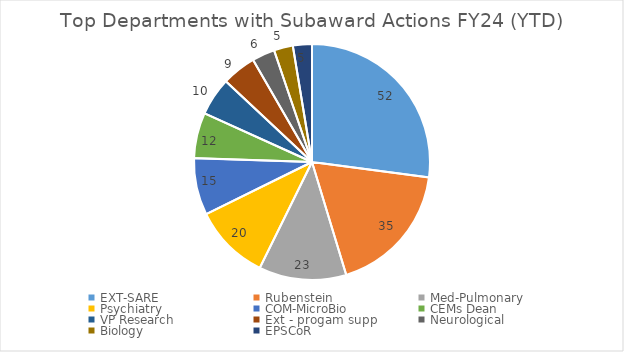
| Category | Total |
|---|---|
| EXT-SARE | 52 |
| Rubenstein | 35 |
| Med-Pulmonary | 23 |
| Psychiatry | 20 |
| COM-MicroBio | 15 |
| CEMs Dean | 12 |
| VP Research | 10 |
| Ext - progam supp | 9 |
| Neurological | 6 |
| Biology | 5 |
| EPSCoR | 5 |